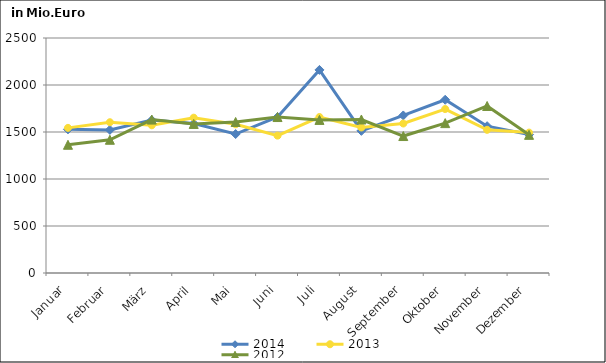
| Category | 2014 | 2013 | 2012 |
|---|---|---|---|
| Januar | 1528.411 | 1543.949 | 1364.093 |
| Februar | 1522.527 | 1603.963 | 1417.231 |
| März | 1626.661 | 1571.45 | 1632.04 |
| April | 1589.917 | 1652.249 | 1585.623 |
| Mai | 1478.314 | 1581.875 | 1606.708 |
| Juni | 1659.563 | 1461.452 | 1659.207 |
| Juli | 2160.552 | 1659.178 | 1628.599 |
| August | 1512.039 | 1548.153 | 1633.093 |
| September | 1676.139 | 1590.452 | 1456.973 |
| Oktober | 1842.815 | 1744.21 | 1594.566 |
| November | 1561.962 | 1523.225 | 1776.795 |
| Dezember | 1473.459 | 1493.69 | 1469.694 |